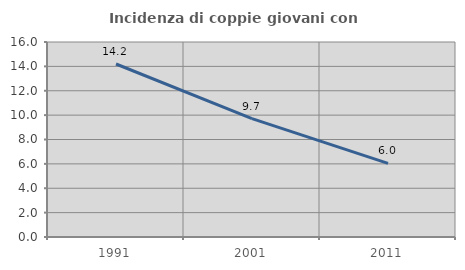
| Category | Incidenza di coppie giovani con figli |
|---|---|
| 1991.0 | 14.195 |
| 2001.0 | 9.708 |
| 2011.0 | 6.041 |